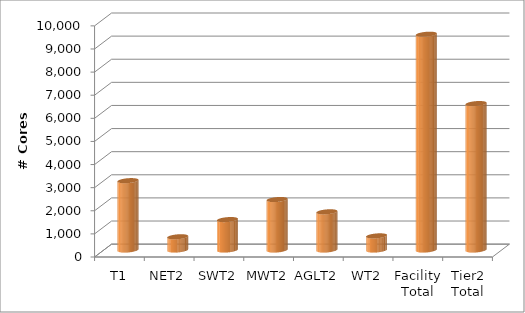
| Category | Series 0 |
|---|---|
| T1 | 3000 |
| NET2 | 572 |
| SWT2 | 1316 |
| MWT2 | 2184 |
| AGLT2 | 1652 |
| WT2 | 611.16 |
| Facility Total | 9335.16 |
| Tier2 Total | 6335.16 |